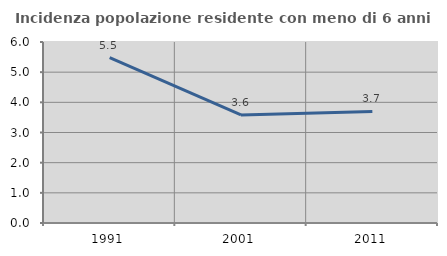
| Category | Incidenza popolazione residente con meno di 6 anni |
|---|---|
| 1991.0 | 5.485 |
| 2001.0 | 3.583 |
| 2011.0 | 3.697 |